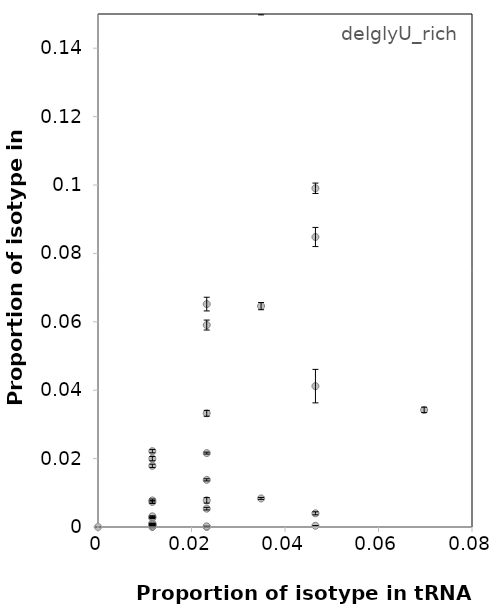
| Category | SBW25 |
|---|---|
| 0.023255813953488372 | 0.033 |
| 0.03488372093023256 | 0.065 |
| 0.046511627906976744 | 0.004 |
| 0.011627906976744186 | 0.001 |
| 0.011627906976744186 | 0.001 |
| 0.011627906976744186 | 0.003 |
| 0.046511627906976744 | 0.085 |
| 0.03488372093023256 | 0.152 |
| 0.011627906976744186 | 0.007 |
| 0.046511627906976744 | 0 |
| 0.023255813953488372 | 0.065 |
| 0.023255813953488372 | 0.059 |
| 0.046511627906976744 | 0.099 |
| 0.0 | 0 |
| 0.046511627906976744 | 0.173 |
| 0.011627906976744186 | 0.018 |
| 0.011627906976744186 | 0 |
| 0.023255813953488372 | 0 |
| 0.03488372093023256 | 0.008 |
| 0.011627906976744186 | 0 |
| 0.046511627906976744 | 0.041 |
| 0.011627906976744186 | 0.001 |
| 0.011627906976744186 | 0 |
| 0.011627906976744186 | 0.008 |
| 0.06976744186046512 | 0.034 |
| 0.023255813953488372 | 0.008 |
| 0.023255813953488372 | 0 |
| 0.011627906976744186 | 0.001 |
| 0.011627906976744186 | 0.003 |
| 0.011627906976744186 | 0.003 |
| 0.011627906976744186 | 0 |
| 0.011627906976744186 | 0 |
| 0.011627906976744186 | 0.02 |
| 0.023255813953488372 | 0.022 |
| 0.011627906976744186 | 0.001 |
| 0.023255813953488372 | 0.005 |
| 0.023255813953488372 | 0.014 |
| 0.011627906976744186 | 0.022 |
| 0.011627906976744186 | 0 |